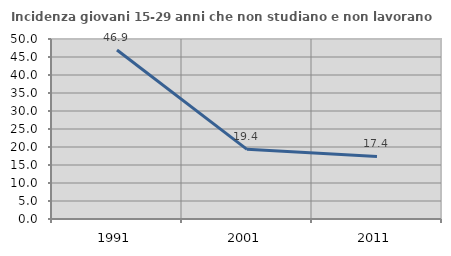
| Category | Incidenza giovani 15-29 anni che non studiano e non lavorano  |
|---|---|
| 1991.0 | 46.934 |
| 2001.0 | 19.355 |
| 2011.0 | 17.391 |